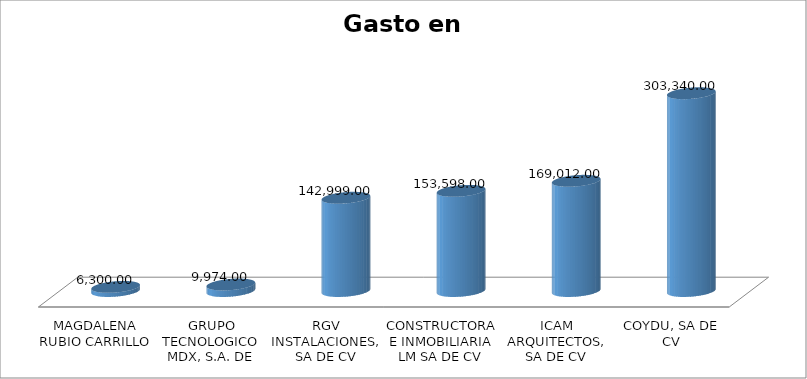
| Category | Suma |
|---|---|
| MAGDALENA RUBIO CARRILLO | 6300 |
| GRUPO TECNOLOGICO MDX, S.A. DE C.V. | 9974 |
| RGV INSTALACIONES, SA DE CV | 142999 |
| CONSTRUCTORA E INMOBILIARIA LM SA DE CV | 153598 |
| ICAM ARQUITECTOS, SA DE CV | 169012 |
| COYDU, SA DE CV | 303340 |